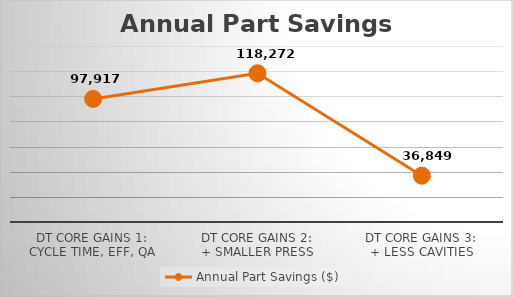
| Category | Annual Part Savings ($) |
|---|---|
| DT Core Gains 1:
Cycle Time, Eff, QA | 97916.508 |
| DT Core Gains 2:
+ Smaller Press | 118272.41 |
| DT Core Gains 3:
+ Less Cavities | 36848.799 |